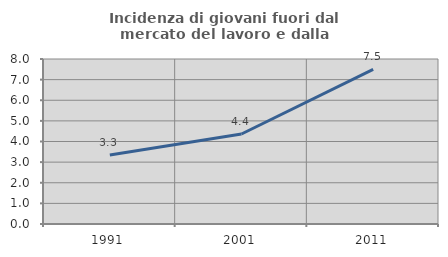
| Category | Incidenza di giovani fuori dal mercato del lavoro e dalla formazione  |
|---|---|
| 1991.0 | 3.343 |
| 2001.0 | 4.364 |
| 2011.0 | 7.5 |